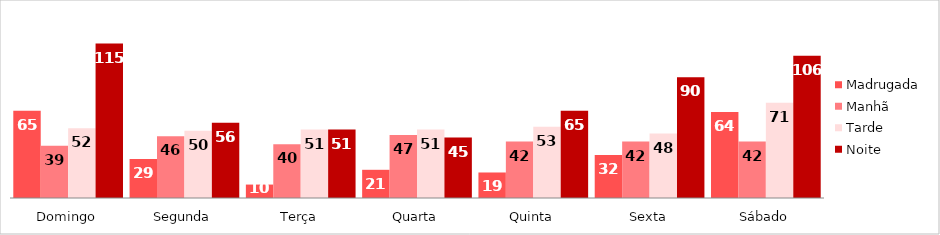
| Category | Madrugada | Manhã | Tarde | Noite |
|---|---|---|---|---|
| Domingo | 65 | 39 | 52 | 115 |
| Segunda | 29 | 46 | 50 | 56 |
| Terça | 10 | 40 | 51 | 51 |
| Quarta | 21 | 47 | 51 | 45 |
| Quinta | 19 | 42 | 53 | 65 |
| Sexta | 32 | 42 | 48 | 90 |
| Sábado | 64 | 42 | 71 | 106 |